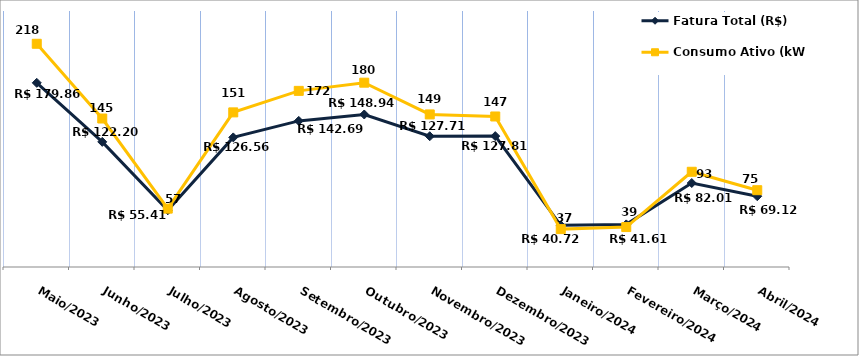
| Category | Fatura Total (R$) | Consumo Ativo (kWh) |
|---|---|---|
| Maio/2023 | 179.86 | 218 |
| Junho/2023 | 122.2 | 145 |
| Julho/2023 | 55.41 | 57 |
| Agosto/2023 | 126.56 | 151 |
| Setembro/2023 | 142.69 | 172 |
| Outubro/2023 | 148.94 | 180 |
| Novembro/2023 | 127.71 | 149 |
| Dezembro/2023 | 127.81 | 147 |
| Janeiro/2024 | 40.72 | 37 |
| Fevereiro/2024 | 41.61 | 39 |
| Março/2024 | 82.01 | 93 |
| Abril/2024 | 69.12 | 75 |